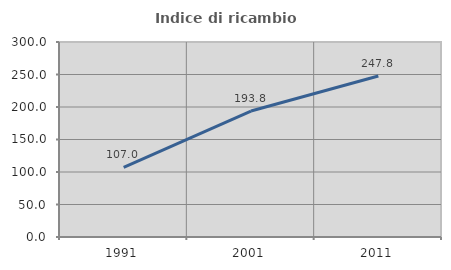
| Category | Indice di ricambio occupazionale  |
|---|---|
| 1991.0 | 107.025 |
| 2001.0 | 193.789 |
| 2011.0 | 247.799 |